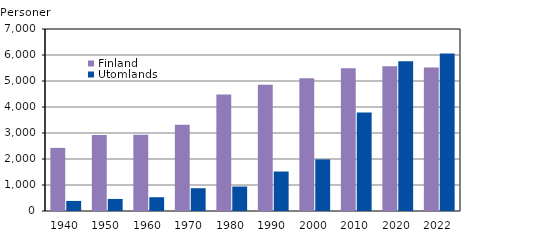
| Category | Finland  | Utomlands |
|---|---|---|
| 1940.0 | 2428 | 387 |
| 1950.0 | 2926 | 464 |
| 1960.0 | 2930 | 530 |
| 1970.0 | 3316 | 877 |
| 1980.0 | 4477 | 942 |
| 1990.0 | 4857 | 1518 |
| 2000.0 | 5109 | 1985 |
| 2010.0 | 5490 | 3785 |
| 2020.0 | 5564 | 5758 |
| 2022.0 | 5524 | 6058 |